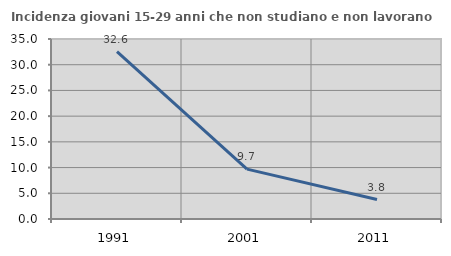
| Category | Incidenza giovani 15-29 anni che non studiano e non lavorano  |
|---|---|
| 1991.0 | 32.558 |
| 2001.0 | 9.696 |
| 2011.0 | 3.787 |